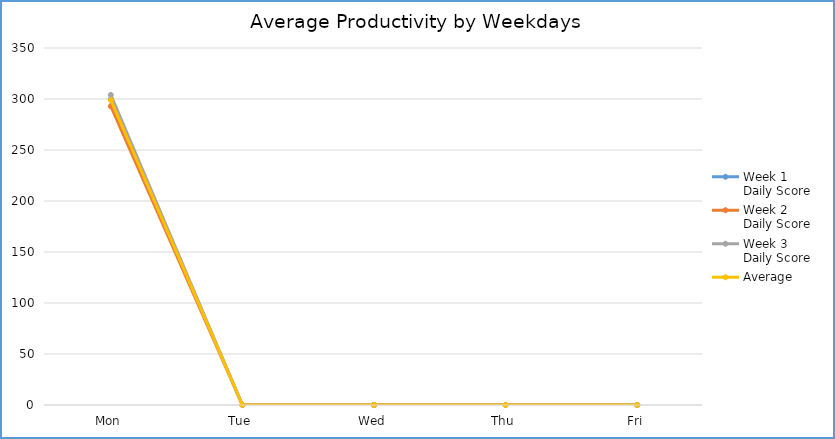
| Category | Week 1 
Daily Score  | Week 2
Daily Score  | Week 3
Daily Score  | Average |
|---|---|---|---|---|
| Mon | 300 | 293 | 304 | 299 |
| Tue | 0 | 0 | 0 | 0 |
| Wed | 0 | 0 | 0 | 0 |
| Thu | 0 | 0 | 0 | 0 |
| Fri | 0 | 0 | 0 | 0 |